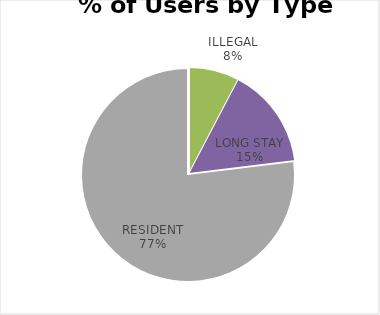
| Category | STAFFORD PLACE |
|---|---|
| COMMUTER | 0 |
| ILLEGAL | 1 |
| LONG STAY | 2 |
| RESIDENT | 10 |
| SHORT STAY | 0 |
| DISABLED | 0 |
| OTHER | 0 |